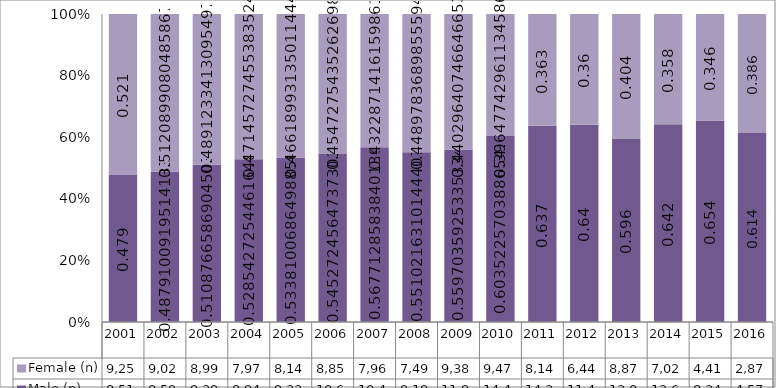
| Category | Male (n) | Female (n) |
|---|---|---|
| 2001.0 | 8515 | 9257 |
| 2002.0 | 8596 | 9022 |
| 2003.0 | 9394 | 8994 |
| 2004.0 | 8944 | 7978 |
| 2005.0 | 9331 | 8149 |
| 2006.0 | 10617 | 8854 |
| 2007.0 | 10455 | 7961 |
| 2008.0 | 9196 | 7493 |
| 2009.0 | 11934 | 9388 |
| 2010.0 | 14426 | 9477 |
| 2011.0 | 14314 | 8145 |
| 2012.0 | 11477 | 6445 |
| 2013.0 | 13098 | 8872 |
| 2014.0 | 12621 | 7026 |
| 2015.0 | 8346 | 4413 |
| 2016.0 | 4574 | 2876 |